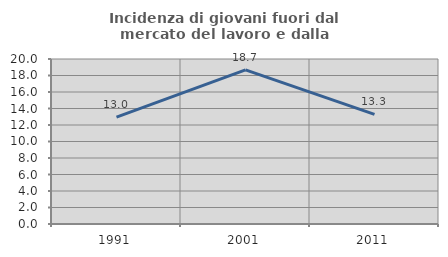
| Category | Incidenza di giovani fuori dal mercato del lavoro e dalla formazione  |
|---|---|
| 1991.0 | 12.955 |
| 2001.0 | 18.675 |
| 2011.0 | 13.287 |